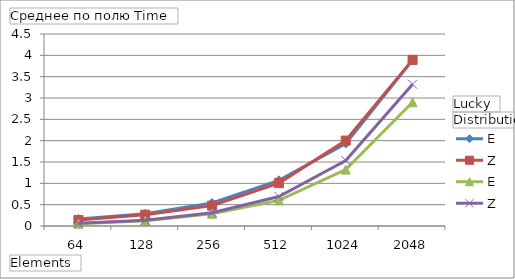
| Category | N - E | N - Z | Y - E | Y - Z |
|---|---|---|---|---|
| 64 | 0.164 | 0.142 | 0.052 | 0.063 |
| 128 | 0.285 | 0.265 | 0.125 | 0.134 |
| 256 | 0.538 | 0.477 | 0.287 | 0.312 |
| 512 | 1.071 | 1.005 | 0.6 | 0.692 |
| 1024 | 1.933 | 2.002 | 1.322 | 1.536 |
| 2048 | 3.891 | 3.893 | 2.9 | 3.323 |